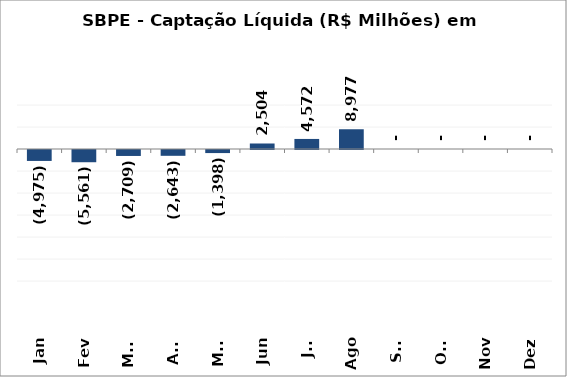
| Category | SBPE - Captação Líquida (R$ Milhões) em 2018 |
|---|---|
| Jan | -4974.781 |
| Fev | -5560.998 |
| Mar | -2708.602 |
| Abr | -2643.342 |
| Mai | -1398.295 |
| Jun | 2504.228 |
| Jul | 4571.518 |
| Ago | 8976.601 |
| Set | 0 |
| Out | 0 |
| Nov | 0 |
| Dez | 0 |